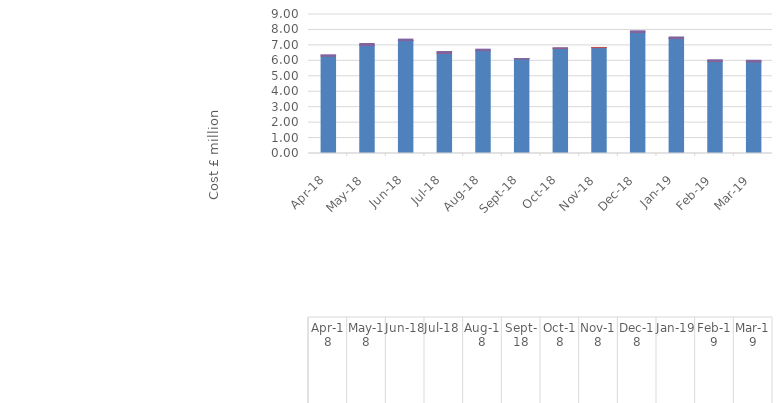
| Category | AS-BM Default Utilisation (Mandatory - CVA) | AS-BM Utilisation (Mandatory - SVA) | AS-BM Reactive Utilisation (Commercial) | AS-BM Syncronous Compensation ( Commercial) | Power Potential ( Commercial) |
|---|---|---|---|---|---|
| 2018-04-01 | 6.32 | 0.007 | 0 | 0.064 | 0 |
| 2018-05-01 | 6.997 | 0.007 | 0 | 0.117 | 0 |
| 2018-06-01 | 7.31 | 0.005 | 0 | 0.092 | 0 |
| 2018-07-01 | 6.499 | 0.006 | 0 | 0.101 | 0 |
| 2018-08-01 | 6.66 | 0.008 | 0 | 0.088 | 0 |
| 2018-09-01 | 6.133 | 0.011 | 0 | 0.005 | 0 |
| 2018-10-01 | 6.811 | 0.013 | 0 | 0.013 | 0 |
| 2018-11-01 | 6.856 | 0.012 | 0 | 0 | 0 |
| 2018-12-01 | 7.866 | 0.005 | 0 | 0.072 | 0 |
| 2019-01-01 | 7.443 | 0.01 | 0 | 0.092 | 0 |
| 2019-02-01 | 5.97 | 0.006 | 0 | 0.092 | 0 |
| 2019-03-01 | 5.938 | 0.007 | 0 | 0.092 | 0 |